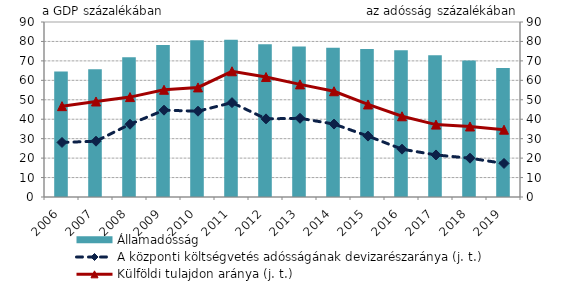
| Category | Államadósság |
|---|---|
| 2006.0 | 64.504 |
| 2007.0 | 65.654 |
| 2008.0 | 71.843 |
| 2009.0 | 78.217 |
| 2010.0 | 80.641 |
| 2011.0 | 80.812 |
| 2012.0 | 78.558 |
| 2013.0 | 77.355 |
| 2014.0 | 76.801 |
| 2015.0 | 76.146 |
| 2016.0 | 75.485 |
| 2017.0 | 72.891 |
| 2018.0 | 70.219 |
| 2019.0 | 66.366 |